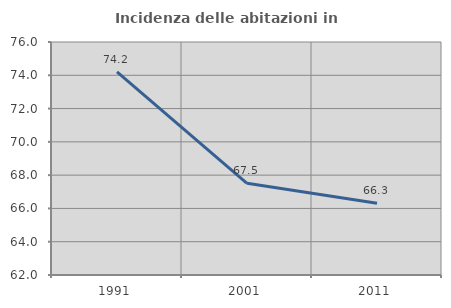
| Category | Incidenza delle abitazioni in proprietà  |
|---|---|
| 1991.0 | 74.203 |
| 2001.0 | 67.507 |
| 2011.0 | 66.308 |